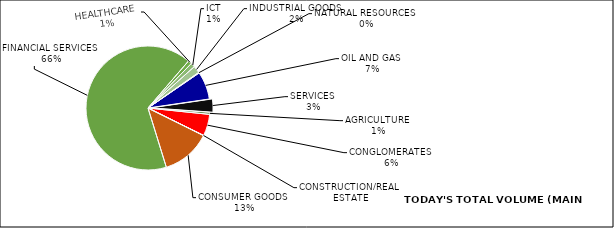
| Category | TODAY'S VOLUME |
|---|---|
| AGRICULTURE | 1455869 |
| CONGLOMERATES | 15242385 |
| CONSTRUCTION/REAL ESTATE | 153137 |
| CONSUMER GOODS | 34802372 |
| FINANCIAL SERVICES | 178670966 |
| HEALTHCARE | 2622282 |
| ICT | 2996918 |
| INDUSTRIAL GOODS | 5048938 |
| NATURAL RESOURCES | 471975 |
| OIL AND GAS | 19579025 |
| SERVICES | 9270811 |